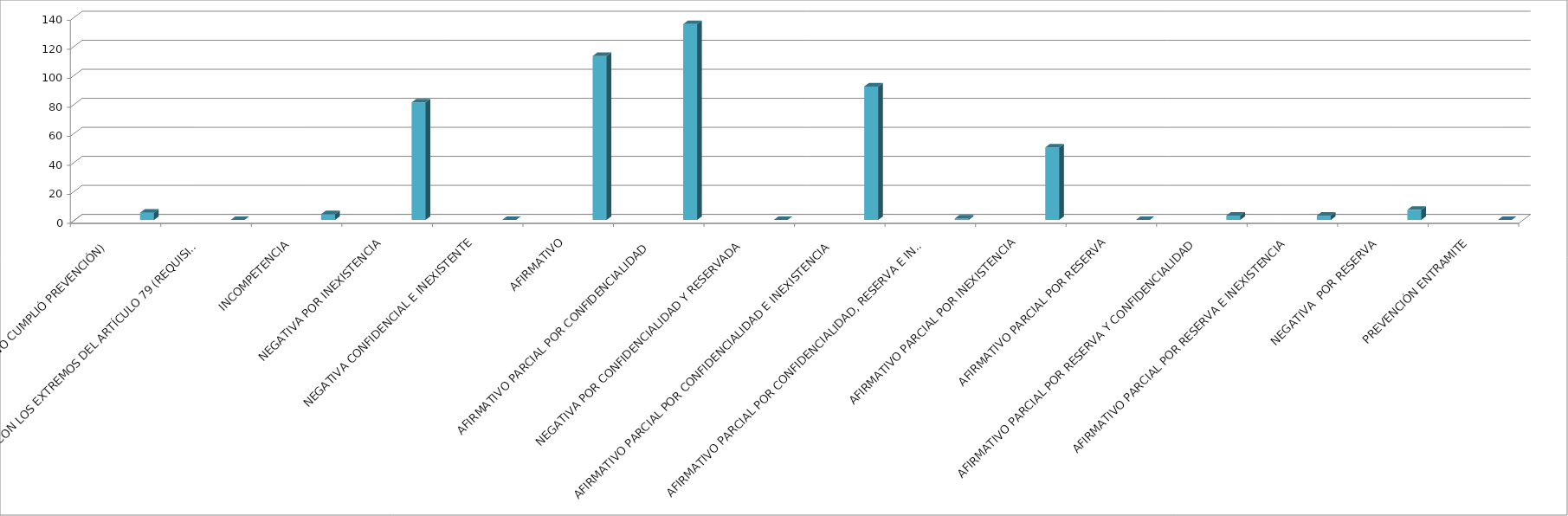
| Category | Series 0 | Series 1 | Series 2 | Series 3 | Series 4 |
|---|---|---|---|---|---|
| SE TIENE POR NO PRESENTADA ( NO CUMPLIÓ PREVENCIÓN) |  |  |  |  | 5 |
| NO CUMPLIO CON LOS EXTREMOS DEL ARTÍCULO 79 (REQUISITOS) |  |  |  |  | 0 |
| INCOMPETENCIA  |  |  |  |  | 4 |
| NEGATIVA POR INEXISTENCIA |  |  |  |  | 81 |
| NEGATIVA CONFIDENCIAL E INEXISTENTE |  |  |  |  | 0 |
| AFIRMATIVO |  |  |  |  | 113 |
| AFIRMATIVO PARCIAL POR CONFIDENCIALIDAD  |  |  |  |  | 135 |
| NEGATIVA POR CONFIDENCIALIDAD Y RESERVADA |  |  |  |  | 0 |
| AFIRMATIVO PARCIAL POR CONFIDENCIALIDAD E INEXISTENCIA |  |  |  |  | 92 |
| AFIRMATIVO PARCIAL POR CONFIDENCIALIDAD, RESERVA E INEXISTENCIA |  |  |  |  | 1 |
| AFIRMATIVO PARCIAL POR INEXISTENCIA |  |  |  |  | 50 |
| AFIRMATIVO PARCIAL POR RESERVA |  |  |  |  | 0 |
| AFIRMATIVO PARCIAL POR RESERVA Y CONFIDENCIALIDAD |  |  |  |  | 3 |
| AFIRMATIVO PARCIAL POR RESERVA E INEXISTENCIA |  |  |  |  | 3 |
| NEGATIVA  POR RESERVA |  |  |  |  | 7 |
| PREVENCIÓN ENTRAMITE |  |  |  |  | 0 |